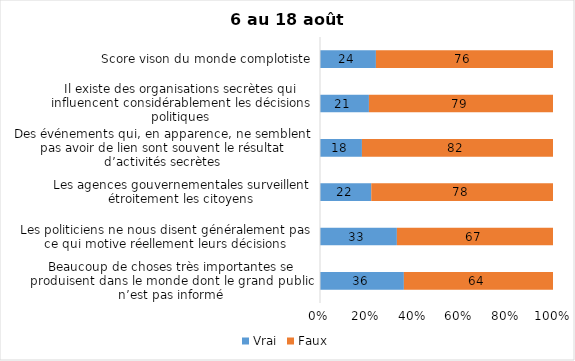
| Category | Vrai | Faux |
|---|---|---|
| Beaucoup de choses très importantes se produisent dans le monde dont le grand public n’est pas informé | 36 | 64 |
| Les politiciens ne nous disent généralement pas ce qui motive réellement leurs décisions | 33 | 67 |
| Les agences gouvernementales surveillent étroitement les citoyens | 22 | 78 |
| Des événements qui, en apparence, ne semblent pas avoir de lien sont souvent le résultat d’activités secrètes | 18 | 82 |
| Il existe des organisations secrètes qui influencent considérablement les décisions politiques | 21 | 79 |
| Score vison du monde complotiste | 24 | 76 |